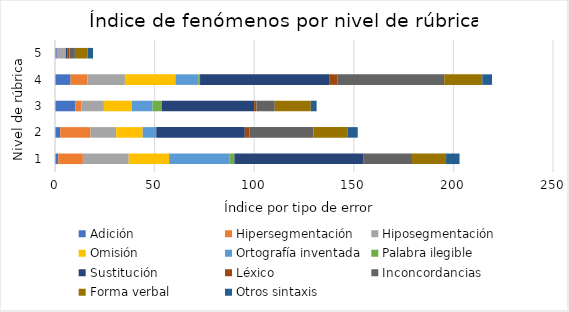
| Category | Adición | Hipersegmentación | Hiposegmentación | Omisión | Ortografía inventada | Palabra ilegible | Sustitución | Léxico | Inconcordancias | Forma verbal | Otros sintaxis |
|---|---|---|---|---|---|---|---|---|---|---|---|
| 1 | 1.639 | 12.354 | 23.006 | 20.278 | 30.459 | 2.326 | 64.633 | 0 | 24.545 | 17.086 | 6.76 |
| 2 | 2.632 | 15.214 | 12.877 | 13.29 | 6.826 | 0 | 44.443 | 2.273 | 32.139 | 17.082 | 5.199 |
| 3 | 10.258 | 2.941 | 11.348 | 14.064 | 10.368 | 4.716 | 46.29 | 1.163 | 9.175 | 18.088 | 2.917 |
| 4 | 7.797 | 8.412 | 18.894 | 25.348 | 11.451 | 0.917 | 65.096 | 3.763 | 53.711 | 19.117 | 4.892 |
| 5 | 0.909 | 0 | 4.545 | 0 | 0 | 0 | 0.909 | 0.909 | 2.727 | 6.364 | 2.727 |